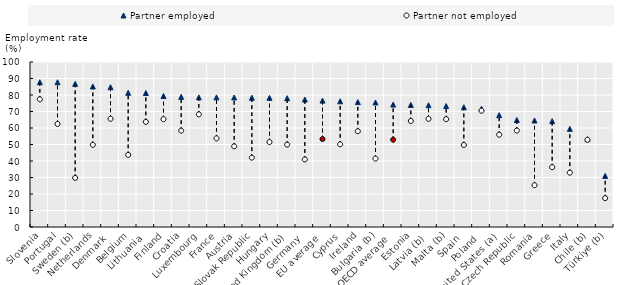
| Category | Partner employed | Partner not employed |
|---|---|---|
| Slovenia | 87.741 | 77.403 |
| Portugal | 87.739 | 62.467 |
| Sweden (b) | 86.776 | 29.773 |
| Netherlands | 85.188 | 49.806 |
| Denmark | 84.746 | 65.59 |
| Belgium | 81.353 | 43.7 |
| Lithuania | 81.218 | 63.695 |
| Finland | 79.359 | 65.378 |
| Croatia | 78.875 | 58.381 |
| Luxembourg | 78.588 | 68.261 |
| France | 78.577 | 53.72 |
| Austria | 78.499 | 48.896 |
| Slovak Republic | 78.368 | 42.024 |
| Hungary | 78.284 | 51.467 |
| United Kingdom (b) | 78.048 | 49.93 |
| Germany | 77.258 | 40.934 |
| EU average | 76.606 | 53.313 |
| Cyprus | 76.19 | 50.094 |
| Ireland | 75.701 | 58.046 |
| Bulgaria (b) | 75.467 | 41.479 |
| OECD average | 74.232 | 52.884 |
| Estonia | 73.99 | 64.254 |
| Latvia (b) | 73.801 | 65.57 |
| Malta (b) | 73.312 | 65.361 |
| Spain | 72.596 | 49.717 |
| Poland | 71.661 | 70.48 |
| United States (a) | 67.81 | 55.93 |
| Czech Republic | 64.867 | 58.453 |
| Romania | 64.559 | 25.32 |
| Greece | 64.174 | 36.251 |
| Italy | 59.478 | 32.931 |
| Chile (b) | 53.269 | 52.845 |
| Türkiye (b) | 30.95 | 17.463 |